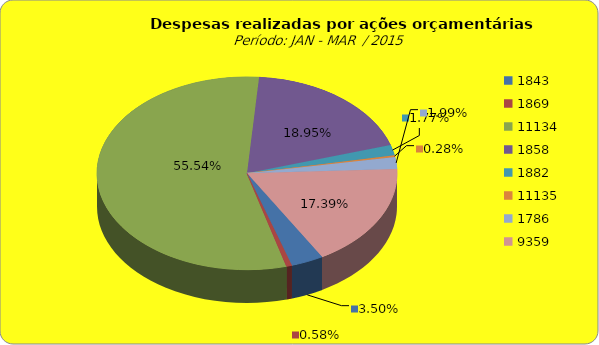
| Category | Series 1 |
|---|---|
| 1843.0 | 2188850.59 |
| 1869.0 | 362856.71 |
| 11134.0 | 34742959.59 |
| 1858.0 | 11850903.73 |
| 1882.0 | 1108230.64 |
| 11135.0 | 177432.7 |
| 1786.0 | 1243373.98 |
| 9359.0 | 10876102.35 |